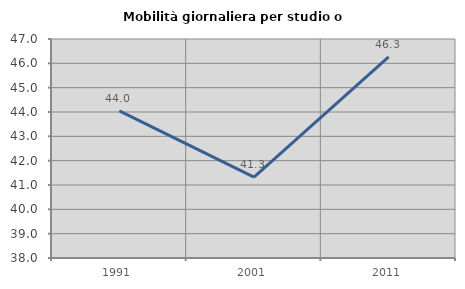
| Category | Mobilità giornaliera per studio o lavoro |
|---|---|
| 1991.0 | 44.045 |
| 2001.0 | 41.327 |
| 2011.0 | 46.265 |